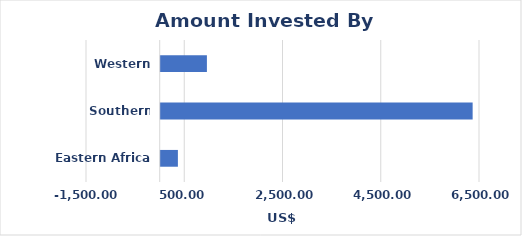
| Category | Amount |
|---|---|
| Eastern Africa | 350.3 |
| Southern Africa | 6350.2 |
| Western Africa | 940.9 |